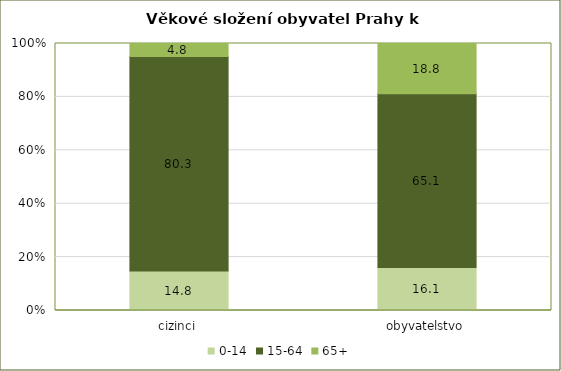
| Category | 0-14 | 15-64 | 65+ |
|---|---|---|---|
| cizinci | 14.83 | 80.333 | 4.837 |
| obyvatelstvo | 16.136 | 65.085 | 18.779 |